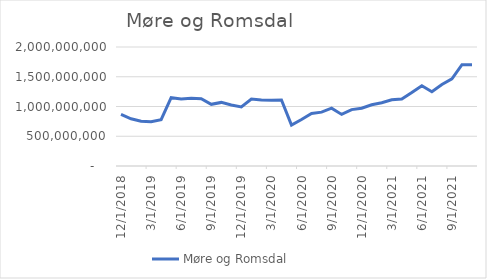
| Category | Møre og Romsdal |
|---|---|
| 12/1/18 | 867161416.667 |
| 1/1/19 | 793786416.667 |
| 2/1/19 | 750813500 |
| 3/1/19 | 742298916.667 |
| 4/1/19 | 779269750 |
| 5/1/19 | 1148457250 |
| 6/1/19 | 1126919750 |
| 7/1/19 | 1136978083.333 |
| 8/1/19 | 1129783333.333 |
| 9/1/19 | 1036212500 |
| 10/1/19 | 1068825000 |
| 11/1/19 | 1026195833.333 |
| 12/1/19 | 993487500 |
| 1/1/20 | 1124966666.667 |
| 2/1/20 | 1108108333.333 |
| 3/1/20 | 1107091666.667 |
| 4/1/20 | 1109466666.667 |
| 5/1/20 | 687350000 |
| 6/1/20 | 782204166.667 |
| 7/1/20 | 883429166.667 |
| 8/1/20 | 905516666.667 |
| 9/1/20 | 972720833.333 |
| 10/1/20 | 867133333.333 |
| 11/1/20 | 947929166.667 |
| 12/1/20 | 970470833.333 |
| 1/1/21 | 1029275000 |
| 2/1/21 | 1063579166.667 |
| 3/1/21 | 1112170833.333 |
| 4/1/21 | 1126091666.667 |
| 5/1/21 | 1234070833.333 |
| 6/1/21 | 1348608333.333 |
| 7/1/21 | 1247770833.333 |
| 8/1/21 | 1370287500 |
| 9/1/21 | 1466437500 |
| 10/1/21 | 1702941666.667 |
| 11/1/21 | 1702979166.667 |